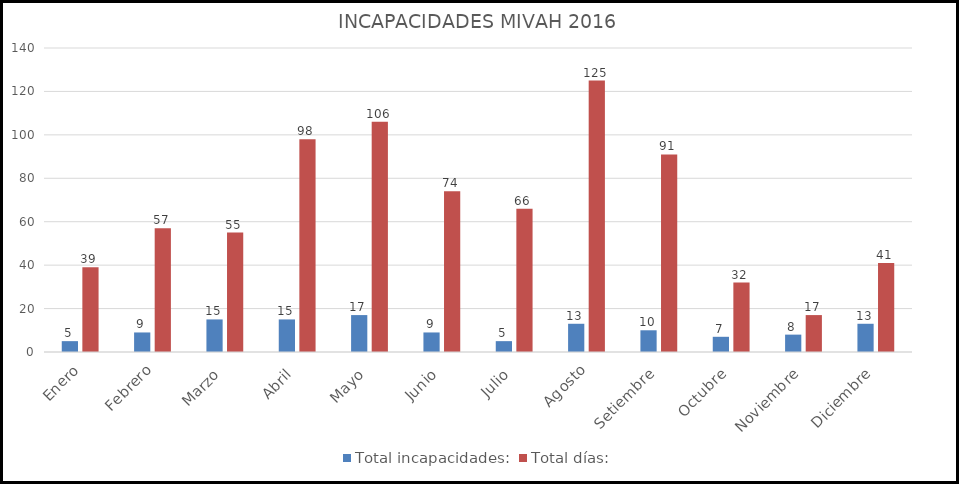
| Category | Total incapacidades: | Total días: |
|---|---|---|
| Enero | 5 | 39 |
| Febrero | 9 | 57 |
| Marzo | 15 | 55 |
| Abril | 15 | 98 |
| Mayo | 17 | 106 |
| Junio | 9 | 74 |
| Julio | 5 | 66 |
| Agosto | 13 | 125 |
| Setiembre | 10 | 91 |
| Octubre | 7 | 32 |
| Noviembre | 8 | 17 |
| Diciembre | 13 | 41 |